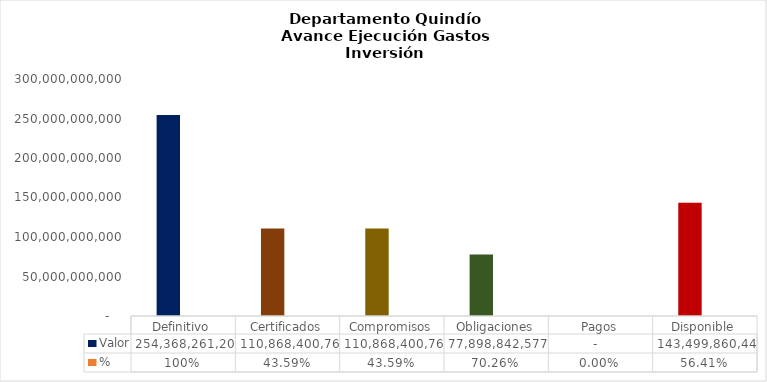
| Category | Valor | % |
|---|---|---|
| Definitivo | 254368261203.778 | 1 |
| Certificados | 110868400760 | 0.436 |
| Compromisos | 110868400760 | 0.436 |
| Obligaciones | 77898842577.33 | 0.703 |
| Pagos | 0 | 0 |
| Disponible | 143499860443.778 | 0.564 |